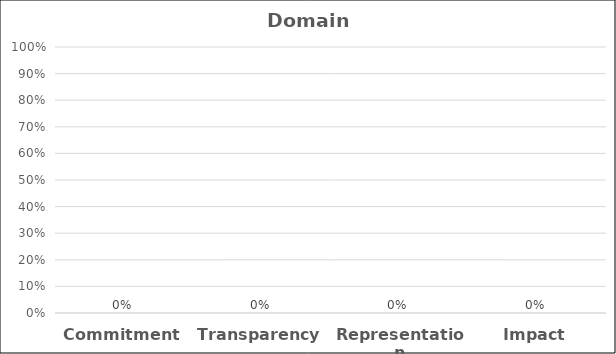
| Category | Domain Scores |
|---|---|
| Commitment | 0 |
| Transparency | 0 |
| Representation | 0 |
| Impact | 0 |